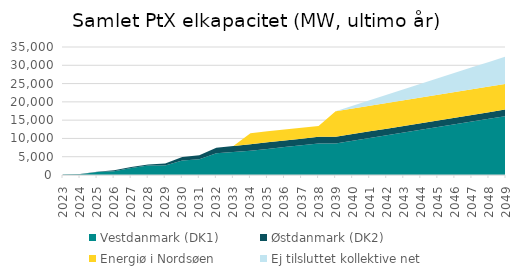
| Category | Vestdanmark (DK1) | Østdanmark (DK2) | Energiø i Nordsøen | Ej tilsluttet kollektive net |
|---|---|---|---|---|
| 2023.0 | 109 | 0 | 0 | 0 |
| 2024.0 | 222 | 31 | 0 | 0 |
| 2025.0 | 794 | 81 | 0 | 0 |
| 2026.0 | 1051.5 | 278 | 0 | 0 |
| 2027.0 | 1901 | 278 | 0 | 0 |
| 2028.0 | 2625.5 | 278 | 0 | 0 |
| 2029.0 | 2625.5 | 538 | 0 | 0 |
| 2030.0 | 3982 | 948 | 0 | 0 |
| 2031.0 | 4332 | 1098 | 0 | 0 |
| 2032.0 | 5932 | 1498 | 0 | 0 |
| 2033.0 | 6282 | 1648 | 0 | 0 |
| 2034.0 | 6632 | 1798 | 3000 | 0 |
| 2035.0 | 7132 | 1798 | 3000 | 0 |
| 2036.0 | 7632 | 1798 | 3000 | 0 |
| 2037.0 | 8132 | 1798 | 3000 | 0 |
| 2038.0 | 8632 | 1798 | 3000 | 0 |
| 2039.0 | 8632 | 1798 | 7000 | 0 |
| 2040.0 | 9382 | 1798 | 7000 | 750 |
| 2041.0 | 10132 | 1798 | 7000 | 1500 |
| 2042.0 | 10882 | 1798 | 7000 | 2250 |
| 2043.0 | 11632 | 1798 | 7000 | 3000 |
| 2044.0 | 12382 | 1798 | 7000 | 3750 |
| 2045.0 | 13132 | 1798 | 7000 | 4500 |
| 2046.0 | 13882 | 1798 | 7000 | 5250 |
| 2047.0 | 14632 | 1798 | 7000 | 6000 |
| 2048.0 | 15382 | 1798 | 7000 | 6750 |
| 2049.0 | 16132 | 1798 | 7000 | 7500 |